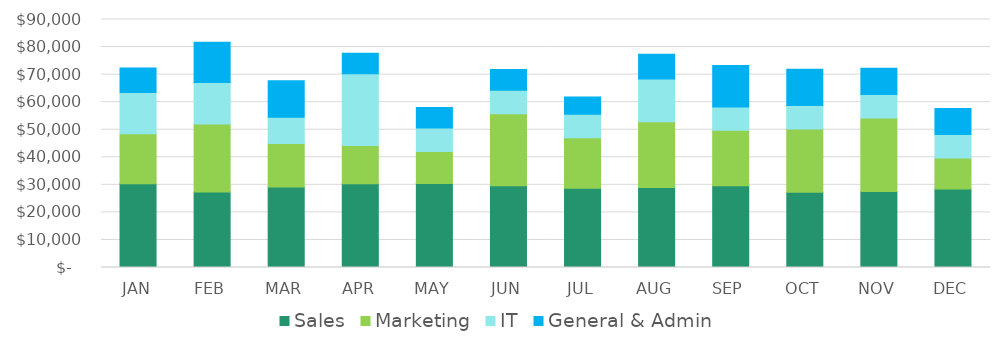
| Category | Sales | Marketing | IT | General & Admin |
|---|---|---|---|---|
|  JAN  | 30435 | 18112 | 15000 | 8810 |
|  FEB  | 27382 | 24712 | 15000 | 14654 |
|  MAR  | 29250 | 15764 | 9500 | 13242 |
|  APR  | 30349 | 13931 | 26004 | 7500 |
|  MAY  | 30526 | 11558 | 8500 | 7500 |
|  JUN  | 29644 | 26196 | 8500 | 7500 |
|  JUL  | 28787 | 18301 | 8500 | 6246 |
|  AUG  | 29011 | 23858 | 15550 | 8975 |
|  SEP  | 29641 | 20145 | 8500 | 15046 |
|  OCT  | 27289 | 22988 | 8500 | 13210 |
|  NOV  | 27625 | 26661 | 8500 | 9500 |
|  DEC  | 28493 | 11245 | 8500 | 9500 |